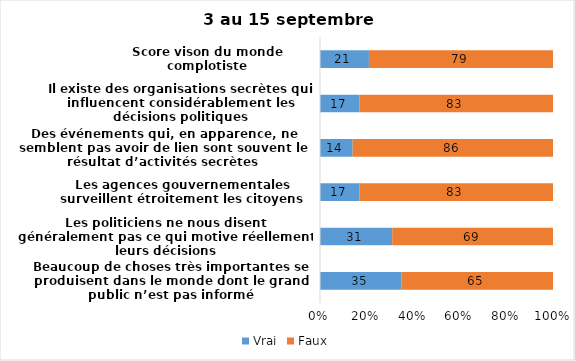
| Category | Vrai | Faux |
|---|---|---|
| Beaucoup de choses très importantes se produisent dans le monde dont le grand public n’est pas informé | 35 | 65 |
| Les politiciens ne nous disent généralement pas ce qui motive réellement leurs décisions | 31 | 69 |
| Les agences gouvernementales surveillent étroitement les citoyens | 17 | 83 |
| Des événements qui, en apparence, ne semblent pas avoir de lien sont souvent le résultat d’activités secrètes | 14 | 86 |
| Il existe des organisations secrètes qui influencent considérablement les décisions politiques | 17 | 83 |
| Score vison du monde complotiste | 21 | 79 |